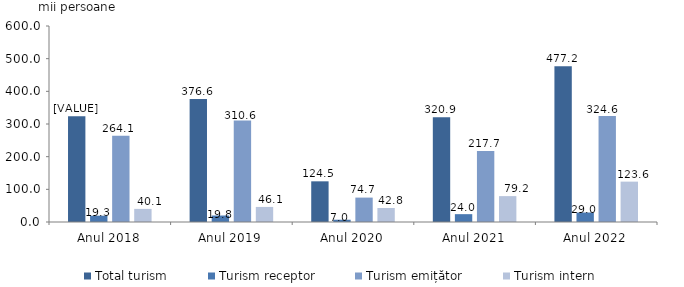
| Category | Total turism | Turism receptor | Turism emițător | Turism intern |
|---|---|---|---|---|
| Anul 2018 | 323.468 | 19.276 | 264.055 | 40.137 |
| Anul 2019 | 376.625 | 19.848 | 310.649 | 46.128 |
| Anul 2020 | 124.506 | 6.95 | 74.708 | 42.848 |
| Anul 2021 | 320.88 | 24.006 | 217.678 | 79.196 |
| Anul 2022 | 477.151 | 29.008 | 324.584 | 123.559 |